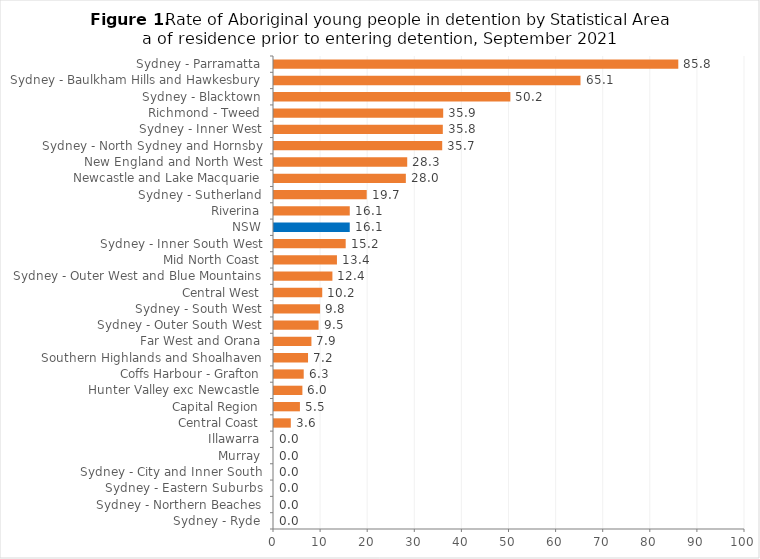
| Category | Series 0 |
|---|---|
| Sydney - Parramatta | 85.837 |
| Sydney - Baulkham Hills and Hawkesbury | 65.076 |
| Sydney - Blacktown | 50.182 |
| Richmond - Tweed | 35.923 |
| Sydney - Inner West | 35.842 |
| Sydney - North Sydney and Hornsby | 35.714 |
| New England and North West | 28.285 |
| Newcastle and Lake Macquarie | 27.992 |
| Sydney - Sutherland | 19.685 |
| Riverina | 16.086 |
| NSW | 16.08 |
| Sydney - Inner South West | 15.221 |
| Mid North Coast | 13.365 |
| Sydney - Outer West and Blue Mountains | 12.402 |
| Central West | 10.242 |
| Sydney - South West | 9.785 |
| Sydney - Outer South West | 9.465 |
| Far West and Orana | 7.947 |
| Southern Highlands and Shoalhaven | 7.225 |
| Coffs Harbour - Grafton | 6.309 |
| Hunter Valley exc Newcastle | 6.03 |
| Capital Region | 5.504 |
| Central Coast | 3.57 |
| Illawarra | 0 |
| Murray | 0 |
| Sydney - City and Inner South | 0 |
| Sydney - Eastern Suburbs | 0 |
| Sydney - Northern Beaches | 0 |
| Sydney - Ryde | 0 |